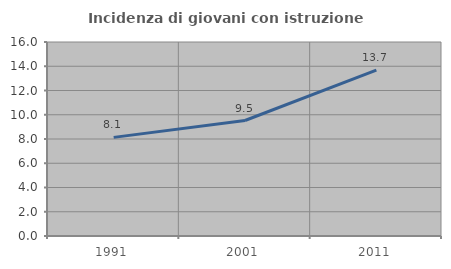
| Category | Incidenza di giovani con istruzione universitaria |
|---|---|
| 1991.0 | 8.134 |
| 2001.0 | 9.524 |
| 2011.0 | 13.684 |